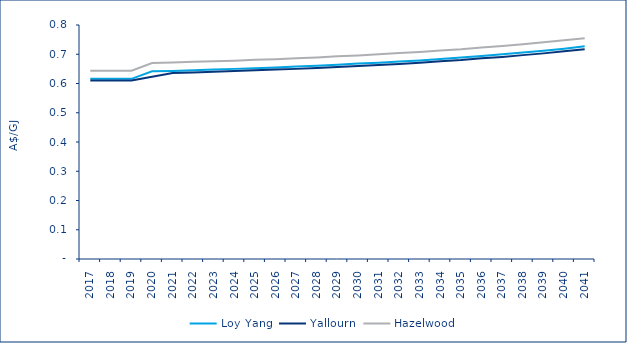
| Category | Loy Yang | Yallourn | Hazelwood |
|---|---|---|---|
| 2017.0 | 0.616 | 0.61 | 0.644 |
| 2018.0 | 0.616 | 0.61 | 0.644 |
| 2019.0 | 0.616 | 0.61 | 0.644 |
| 2020.0 | 0.642 | 0.623 | 0.67 |
| 2021.0 | 0.643 | 0.636 | 0.672 |
| 2022.0 | 0.645 | 0.638 | 0.674 |
| 2023.0 | 0.648 | 0.64 | 0.676 |
| 2024.0 | 0.65 | 0.643 | 0.678 |
| 2025.0 | 0.652 | 0.645 | 0.681 |
| 2026.0 | 0.655 | 0.648 | 0.683 |
| 2027.0 | 0.658 | 0.65 | 0.686 |
| 2028.0 | 0.661 | 0.653 | 0.689 |
| 2029.0 | 0.664 | 0.656 | 0.693 |
| 2030.0 | 0.668 | 0.66 | 0.696 |
| 2031.0 | 0.671 | 0.663 | 0.7 |
| 2032.0 | 0.675 | 0.667 | 0.704 |
| 2033.0 | 0.679 | 0.671 | 0.708 |
| 2034.0 | 0.684 | 0.676 | 0.713 |
| 2035.0 | 0.689 | 0.68 | 0.717 |
| 2036.0 | 0.694 | 0.686 | 0.723 |
| 2037.0 | 0.7 | 0.691 | 0.728 |
| 2038.0 | 0.706 | 0.697 | 0.734 |
| 2039.0 | 0.712 | 0.703 | 0.741 |
| 2040.0 | 0.719 | 0.71 | 0.748 |
| 2041.0 | 0.727 | 0.717 | 0.755 |